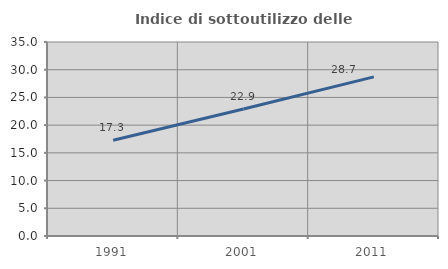
| Category | Indice di sottoutilizzo delle abitazioni  |
|---|---|
| 1991.0 | 17.27 |
| 2001.0 | 22.909 |
| 2011.0 | 28.702 |